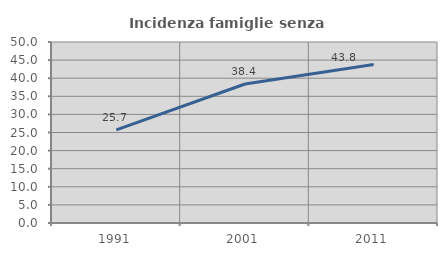
| Category | Incidenza famiglie senza nuclei |
|---|---|
| 1991.0 | 25.745 |
| 2001.0 | 38.407 |
| 2011.0 | 43.793 |